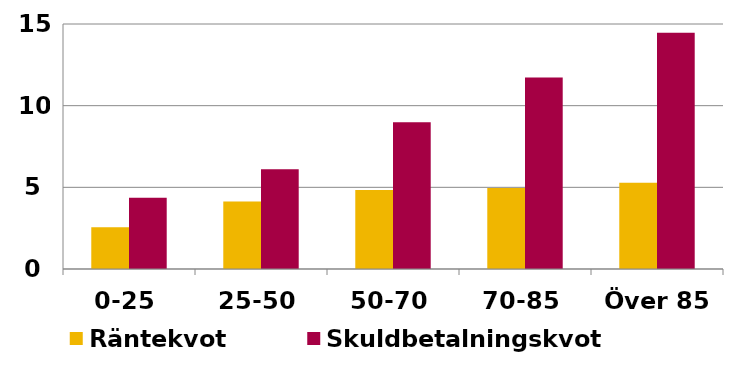
| Category | Räntekvot | Skuldbetalningskvot |
|---|---|---|
| 0-25 | 2.561 | 4.365 |
| 25-50 | 4.137 | 6.103 |
| 50-70 | 4.834 | 8.988 |
| 70-85 | 4.952 | 11.719 |
| Över 85 | 5.288 | 14.462 |